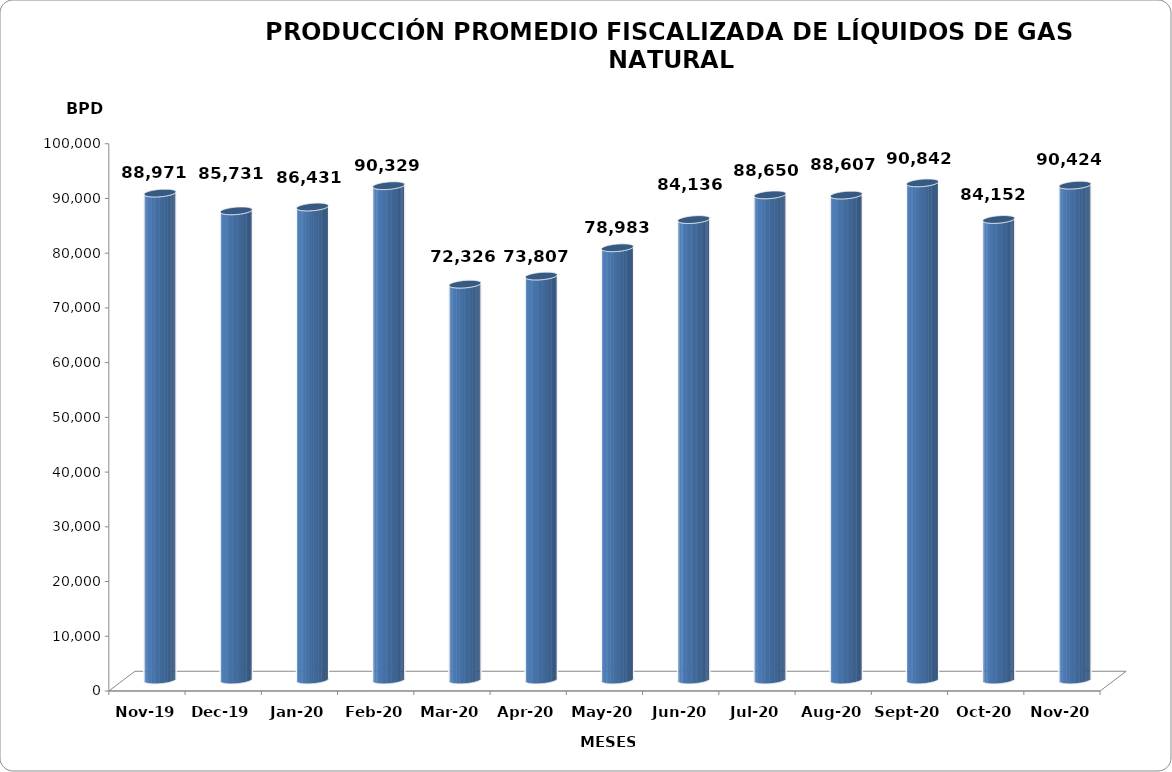
| Category | Series 0 |
|---|---|
| 2019-11-01 | 88971.4 |
| 2019-12-01 | 85731 |
| 2020-01-01 | 86431 |
| 2020-02-01 | 90329 |
| 2020-03-01 | 72326 |
| 2020-04-01 | 73807 |
| 2020-05-01 | 78983 |
| 2020-06-01 | 84136 |
| 2020-07-01 | 88650 |
| 2020-08-01 | 88607 |
| 2020-09-01 | 90842 |
| 2020-10-01 | 84152 |
| 2020-11-01 | 90424 |